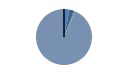
| Category | Series 0 |
|---|---|
| ARRASTRE | 85 |
| CERCO | 63 |
| PALANGRE | 12 |
| REDES DE ENMALLE | 4 |
| ARTES FIJAS | 1 |
| ARTES MENORES | 2462 |
| SIN TIPO ASIGNADO | 1 |